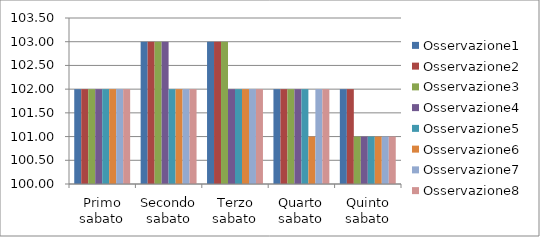
| Category | Osservazione1 | Osservazione2 | Osservazione3 | Osservazione4 | Osservazione5 | Osservazione6 | Osservazione7 | Osservazione8 |
|---|---|---|---|---|---|---|---|---|
| Primo sabato | 102 | 102 | 102 | 102 | 102 | 102 | 102 | 102 |
| Secondo sabato | 103 | 103 | 103 | 103 | 102 | 102 | 102 | 102 |
| Terzo sabato | 103 | 103 | 103 | 102 | 102 | 102 | 102 | 102 |
| Quarto sabato | 102 | 102 | 102 | 102 | 102 | 101 | 102 | 102 |
| Quinto sabato | 102 | 102 | 101 | 101 | 101 | 101 | 101 | 101 |